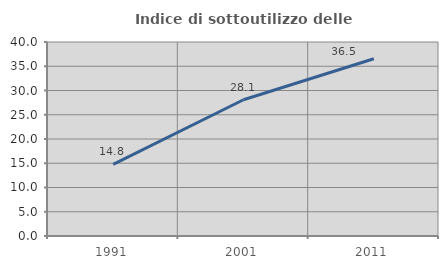
| Category | Indice di sottoutilizzo delle abitazioni  |
|---|---|
| 1991.0 | 14.752 |
| 2001.0 | 28.091 |
| 2011.0 | 36.543 |